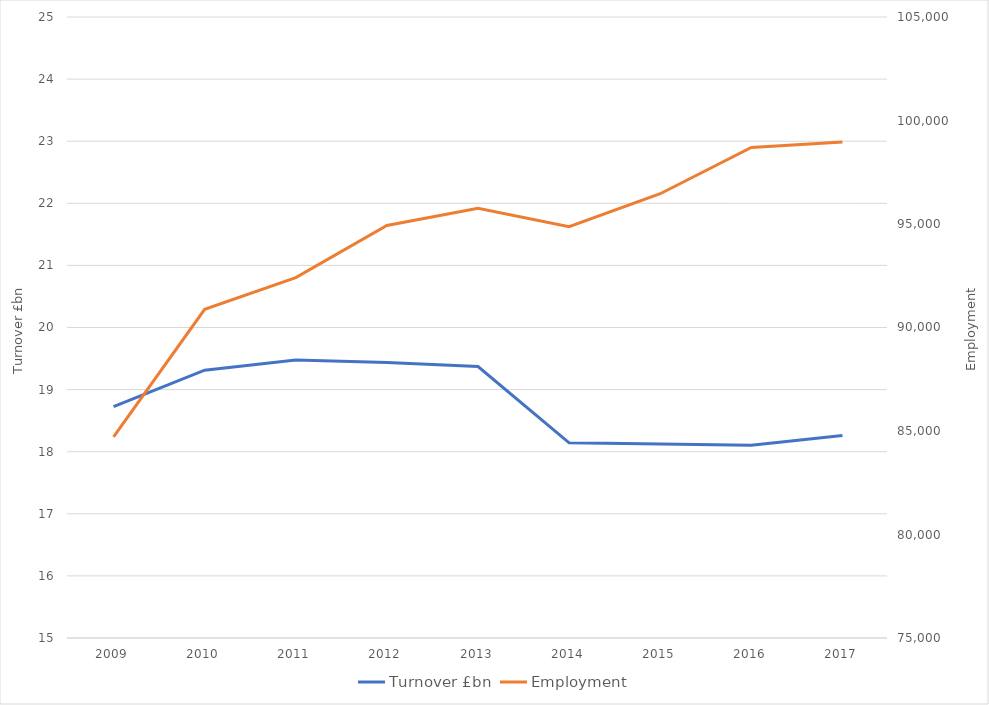
| Category | Turnover £bn |
|---|---|
|  2009  | 18.726 |
|  2010  | 19.312 |
|  2011  | 19.478 |
|  2012  | 19.438 |
|  2013  | 19.372 |
|  2014  | 18.142 |
|  2015  | 18.124 |
|  2016  | 18.105 |
|  2017  | 18.262 |